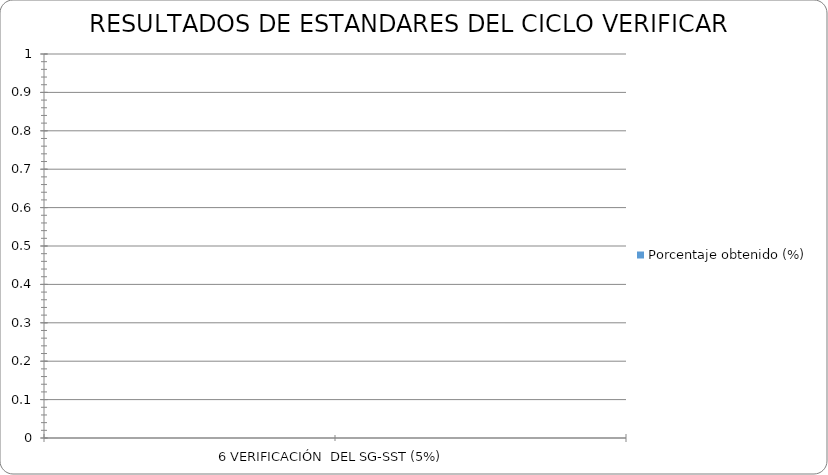
| Category | Porcentaje obtenido (%) |
|---|---|
| 6 VERIFICACIÓN  DEL SG-SST (5%) | 0 |